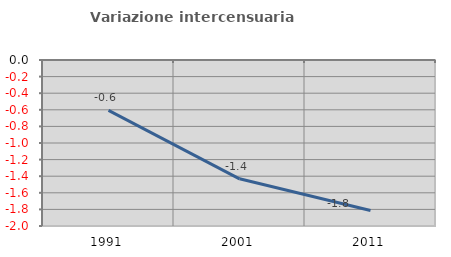
| Category | Variazione intercensuaria annua |
|---|---|
| 1991.0 | -0.607 |
| 2001.0 | -1.431 |
| 2011.0 | -1.813 |